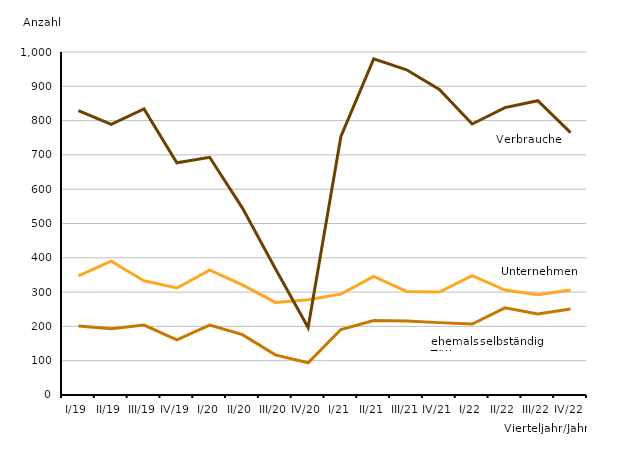
| Category | Series 0 | Series 1 | Series 2 |
|---|---|---|---|
| I/19 | 347 | 829 | 201 |
| II/19 | 390 | 789 | 193 |
| III/19 | 333 | 834 | 204 |
| IV/19 | 312 | 677 | 161 |
| I/20 | 364 | 693 | 204 |
| II/20 | 321 | 545 | 176 |
| III/20 | 270 | 369 | 117 |
| IV/20 | 278 | 197 | 94 |
| I/21 | 294 | 754 | 191 |
| II/21 | 346 | 980 | 217 |
| III/21 | 302 | 948 | 216 |
| IV/21 | 300 | 891 | 211 |
| I/22 | 348 | 790 | 207 |
| II/22 | 306 | 838 | 254 |
| III/22 | 292 | 858 | 236 |
| IV/22 | 306 | 765 | 251 |